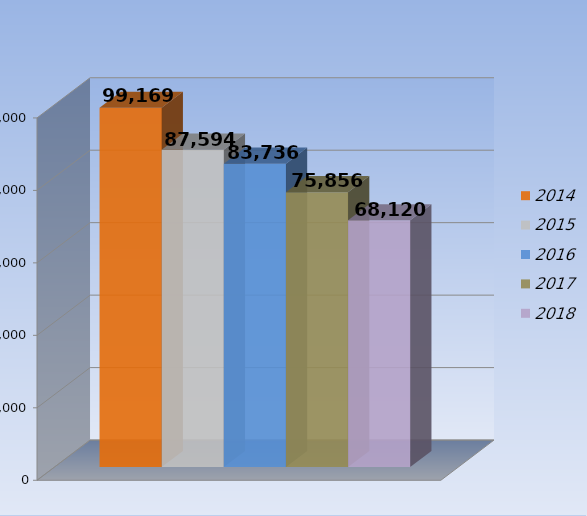
| Category | 2014 | 2015 | 2016 | 2017 | 2018 |
|---|---|---|---|---|---|
| 0 | 99169 | 87594 | 83736 | 75856 | 68120 |